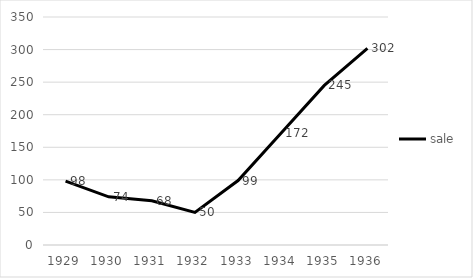
| Category | sale |
|---|---|
| 1929.0 | 98 |
| 1930.0 | 74 |
| 1931.0 | 68 |
| 1932.0 | 50 |
| 1933.0 | 99 |
| 1934.0 | 172 |
| 1935.0 | 245 |
| 1936.0 | 302 |